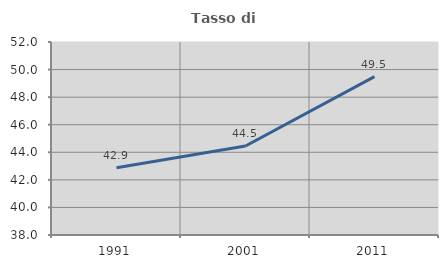
| Category | Tasso di occupazione   |
|---|---|
| 1991.0 | 42.877 |
| 2001.0 | 44.46 |
| 2011.0 | 49.486 |